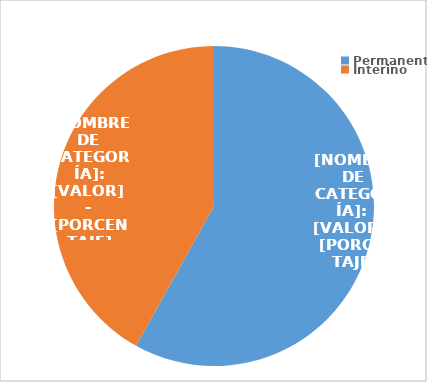
| Category | Series 0 |
|---|---|
| Permanente | 3222 |
| Interino | 2324 |